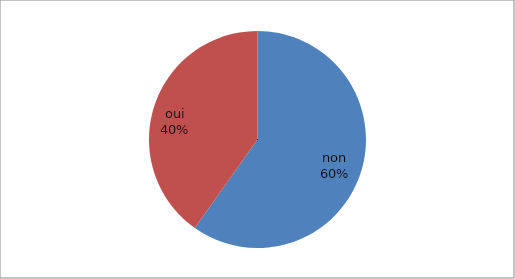
| Category | Series 0 |
|---|---|
| non | 64 |
| oui | 43 |